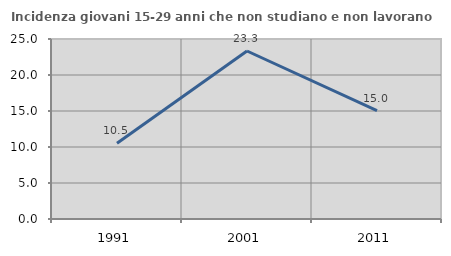
| Category | Incidenza giovani 15-29 anni che non studiano e non lavorano  |
|---|---|
| 1991.0 | 10.518 |
| 2001.0 | 23.333 |
| 2011.0 | 15.038 |